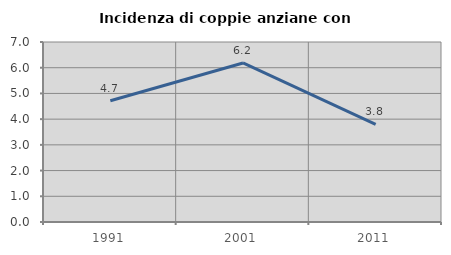
| Category | Incidenza di coppie anziane con figli |
|---|---|
| 1991.0 | 4.717 |
| 2001.0 | 6.186 |
| 2011.0 | 3.797 |